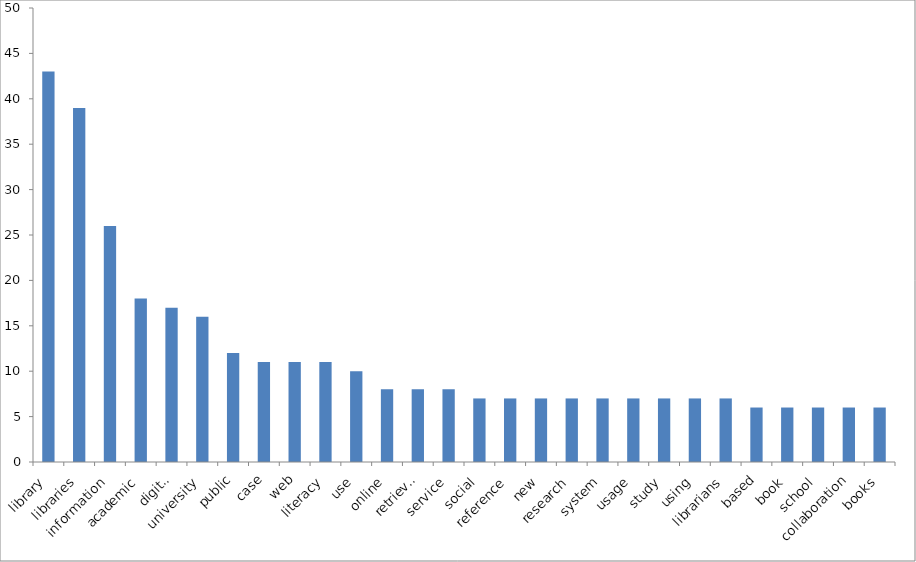
| Category | Occurrences |
|---|---|
| library | 43 |
| libraries | 39 |
| information | 26 |
| academic | 18 |
| digital | 17 |
| university | 16 |
| public | 12 |
| case | 11 |
| web | 11 |
| literacy | 11 |
| use | 10 |
| online | 8 |
| retrieval | 8 |
| service | 8 |
| social | 7 |
| reference | 7 |
| new | 7 |
| research | 7 |
| system | 7 |
| usage | 7 |
| study | 7 |
| using | 7 |
| librarians | 7 |
| based | 6 |
| book | 6 |
| school | 6 |
| collaboration | 6 |
| books | 6 |